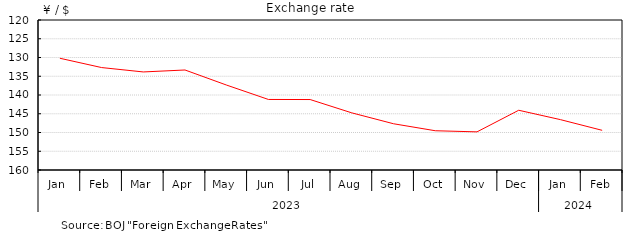
| Category | Series 0 |
|---|---|
| 0 | 130.2 |
| 1 | 132.68 |
| 2 | 133.85 |
| 3 | 133.33 |
| 4 | 137.37 |
| 5 | 141.19 |
| 6 | 141.21 |
| 7 | 144.77 |
| 8 | 147.67 |
| 9 | 149.53 |
| 10 | 149.83 |
| 11 | 144.07 |
| 12 | 146.57 |
| 13 | 149.42 |